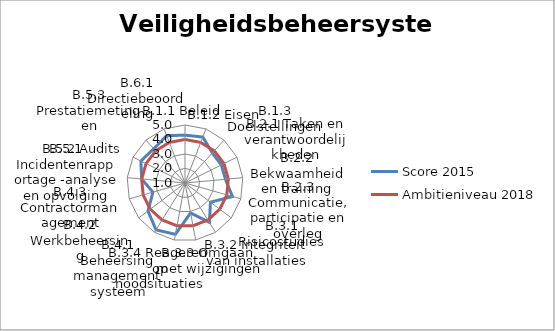
| Category | Score 2015 | Ambitieniveau 2018 |
|---|---|---|
| B.1.1 Beleid | 4.3 | 4 |
| B.1.2 Eisen | 4.4 | 4 |
| B.1.3 Doelstellingen | 3.8 | 4 |
| B.2.1 Taken en verantwoordelijkheden | 3.8 | 4 |
| B.2.2 Bekwaamheid en training | 3.8 | 4 |
| B.2.3 Communicatie, participatie en overleg | 4.4 | 4 |
| B.3.1 Risicostudies | 3.2 | 4 |
| B.3.2 Integriteit van installaties | 4.2 | 4 |
| B.3.3 Omgaan met wijzigingen | 3.1 | 4 |
| B.3.4 Reageren op noodsituaties | 4.6 | 4 |
| B.4.1 Beheersing management systeem | 4.8 | 4 |
| B.4.2 Werkbeheersing | 4.2 | 4 |
| B.4.3 Contractormanagement | 3.3 | 4 |
| B.5.1 Incidentenrapportage -analyse en opvolging | 4 | 4 |
| B.5.2 Audits | 4.4 | 4 |
| B.5.3 Prestatiemetingen | 4.2 | 4 |
| B.6.1 Directiebeoordeling | 4.5 | 4 |